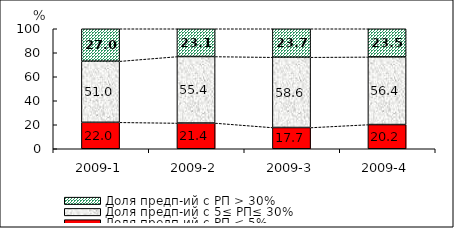
| Category | Доля предп-ий с РП < 5% | Доля предп-ий с 5≤ РП≤ 30% | Доля предп-ий с РП > 30% |
|---|---|---|---|
| 2009-1 | 22.038 | 50.961 | 27.001 |
| 2009-2 | 21.436 | 55.434 | 23.131 |
| 2009-3 | 17.709 | 58.579 | 23.712 |
| 2009-4 | 20.166 | 56.376 | 23.457 |